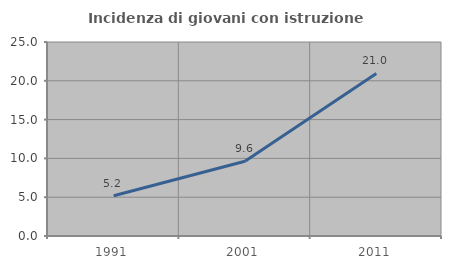
| Category | Incidenza di giovani con istruzione universitaria |
|---|---|
| 1991.0 | 5.19 |
| 2001.0 | 9.623 |
| 2011.0 | 20.95 |